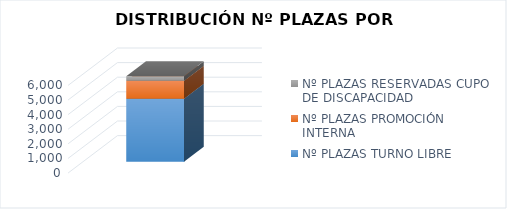
| Category | Nº PLAZAS TURNO LIBRE | Nº PLAZAS PROMOCIÓN INTERNA | Nº PLAZAS RESERVADAS CUPO DE DISCAPACIDAD |
|---|---|---|---|
| 0 | 4317 | 1224 | 311 |